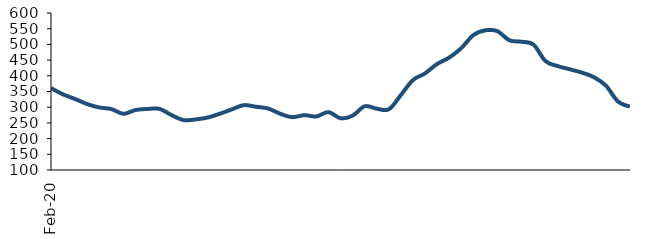
| Category | Series 0 |
|---|---|
| 2020-02-01 | 360.883 |
| 2020-03-01 | 340.754 |
| 2020-04-01 | 326.108 |
| 2020-05-01 | 309.949 |
| 2020-06-01 | 299.181 |
| 2020-07-01 | 294.112 |
| 2020-08-01 | 278.992 |
| 2020-09-01 | 290.987 |
| 2020-10-01 | 294.359 |
| 2020-11-01 | 294.596 |
| 2020-12-01 | 274.651 |
| 2021-01-01 | 258.932 |
| 2021-02-01 | 261.112 |
| 2021-03-01 | 267.235 |
| 2021-04-01 | 279.241 |
| 2021-05-01 | 293.25 |
| 2021-06-01 | 306.524 |
| 2021-07-01 | 301.301 |
| 2021-08-01 | 295.799 |
| 2021-09-01 | 279.082 |
| 2021-10-01 | 268.296 |
| 2021-11-01 | 274.558 |
| 2021-12-01 | 270.511 |
| 2022-01-01 | 284.312 |
| 2022-02-01 | 264.809 |
| 2022-03-01 | 272.939 |
| 2022-04-01 | 302.833 |
| 2022-05-01 | 295.467 |
| 2022-06-01 | 293.185 |
| 2022-07-01 | 338.335 |
| 2022-08-01 | 386.233 |
| 2022-09-01 | 407.447 |
| 2022-10-01 | 437.443 |
| 2022-11-01 | 457.804 |
| 2022-12-01 | 487.578 |
| 2023-01-01 | 529.085 |
| 2023-02-01 | 544.808 |
| 2023-03-01 | 542.145 |
| 2023-04-01 | 513.135 |
| 2023-05-01 | 508.445 |
| 2023-06-01 | 499.29 |
| 2023-07-01 | 446.623 |
| 2023-08-01 | 430.971 |
| 2023-09-01 | 420.849 |
| 2023-10-01 | 410.302 |
| 2023-11-01 | 395.771 |
| 2023-12-01 | 368.753 |
| 2024-01-01 | 318.364 |
| 2024-02-01 | 301.641 |